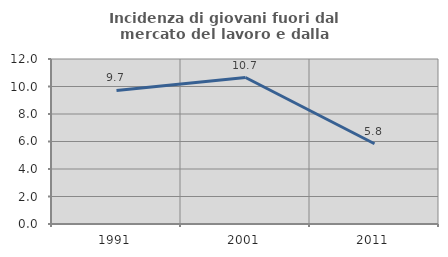
| Category | Incidenza di giovani fuori dal mercato del lavoro e dalla formazione  |
|---|---|
| 1991.0 | 9.714 |
| 2001.0 | 10.654 |
| 2011.0 | 5.837 |